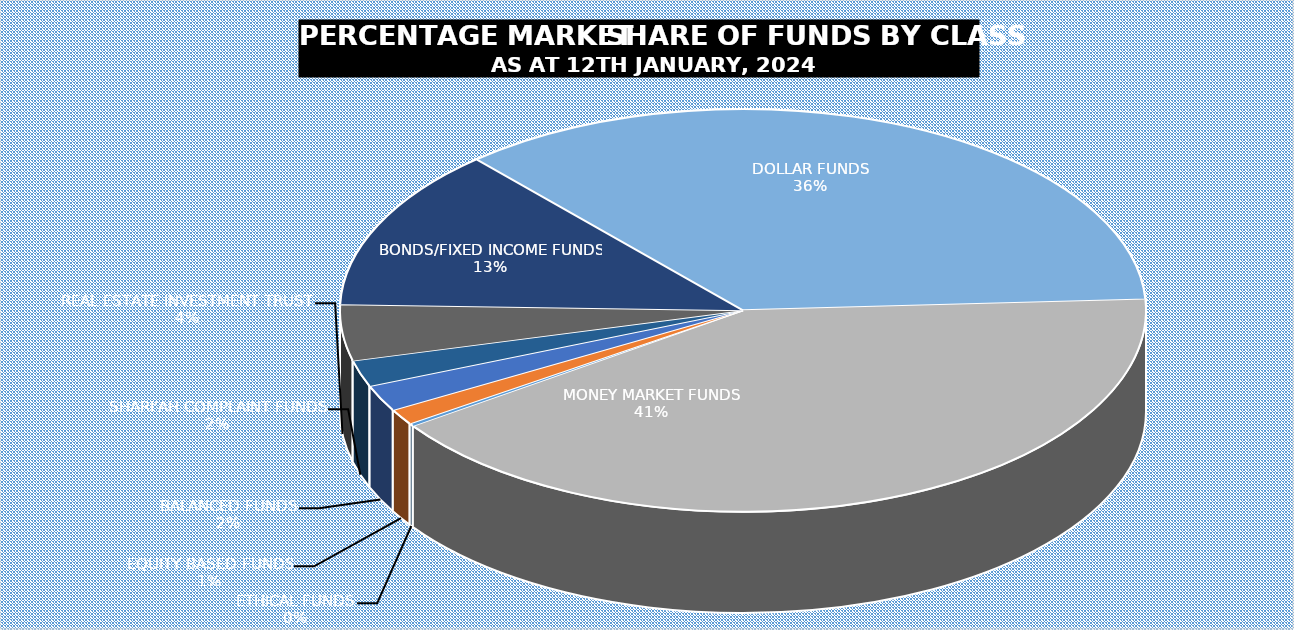
| Category | 12-Jan |
|---|---|
| ETHICAL FUNDS | 4848445844.8 |
| EQUITY BASED FUNDS | 27950770849.197 |
| BALANCED FUNDS | 46709251286.749 |
| SHARI'AH COMPLAINT FUNDS | 47102830010.42 |
| REAL ESTATE INVESTMENT TRUST | 99637490377.519 |
| BONDS/FIXED INCOME FUNDS | 288835807549.413 |
| DOLLAR FUNDS | 790548059586.411 |
| MONEY MARKET FUNDS | 912572121651.287 |